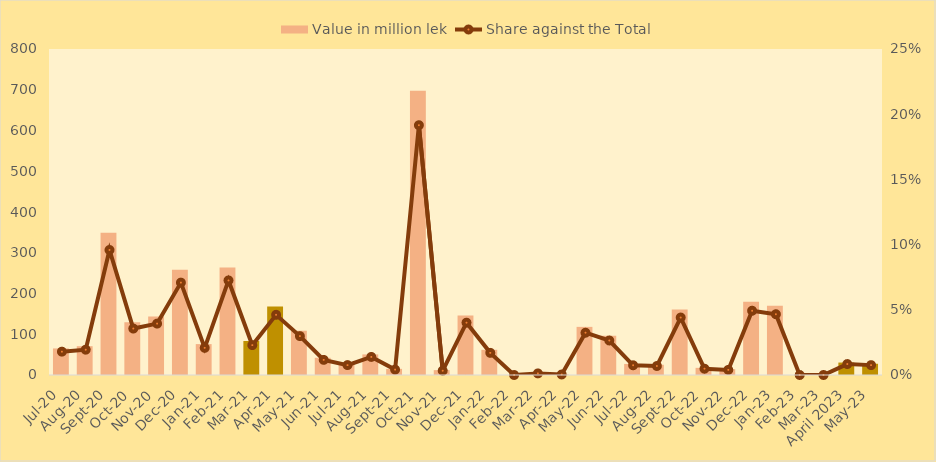
| Category | Value in million lek |
|---|---|
| Jul-20 | 65.205 |
| Aug-20 | 70.7 |
| Sep-20 | 349.195 |
| Oct-20 | 129.71 |
| Nov-20 | 143.57 |
| Dec-20 | 258.055 |
| Jan-21 | 75.853 |
| Feb-21 | 264.11 |
| Mar-21 | 83.405 |
| Apr-21 | 168.143 |
| May-21 | 108.643 |
| Jun-21 | 42.252 |
| Jul-21 | 27.673 |
| Aug-21 | 50.492 |
| Sep-21 | 15.05 |
| Oct-21 | 697.662 |
| Nov-21 | 11.956 |
| Dec-21 | 146.16 |
| Jan-22 | 61.857 |
| Feb-22 | 0 |
| Mar-22 | 4.451 |
| Apr-22 | 1.44 |
| May-22 | 118.1 |
| Jun-22 | 96.353 |
| Jul-22 | 27.154 |
| Aug-22 | 25.128 |
| Sep-22 | 160.465 |
| Oct-22 | 17.538 |
| Nov-22 | 14.283 |
| Dec-22 | 179.51 |
| Jan-23 | 169.756 |
| Feb-23 | 0 |
| Mar-23 | 0 |
| April 2023 | 30.552 |
| May-23 | 27.585 |